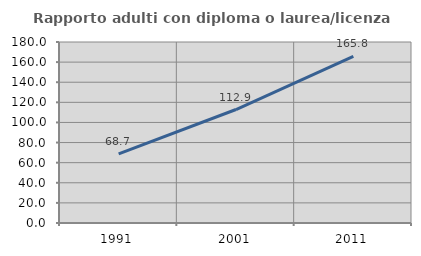
| Category | Rapporto adulti con diploma o laurea/licenza media  |
|---|---|
| 1991.0 | 68.65 |
| 2001.0 | 112.859 |
| 2011.0 | 165.807 |